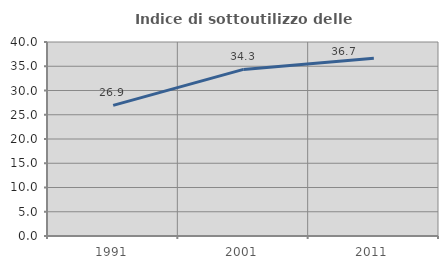
| Category | Indice di sottoutilizzo delle abitazioni  |
|---|---|
| 1991.0 | 26.925 |
| 2001.0 | 34.35 |
| 2011.0 | 36.668 |